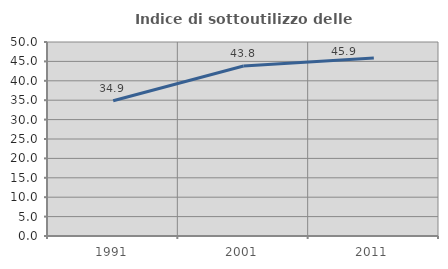
| Category | Indice di sottoutilizzo delle abitazioni  |
|---|---|
| 1991.0 | 34.862 |
| 2001.0 | 43.817 |
| 2011.0 | 45.857 |